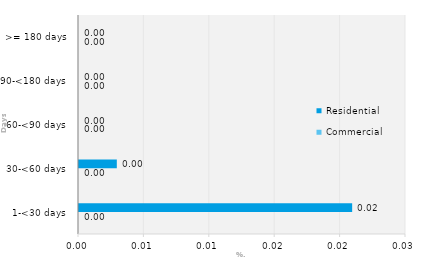
| Category | Commercial | Residential |
|---|---|---|
| 1-<30 days | 0 | 0.021 |
| 30-<60 days | 0 | 0.003 |
| 60-<90 days | 0 | 0 |
| 90-<180 days | 0 | 0 |
| >= 180 days | 0 | 0 |